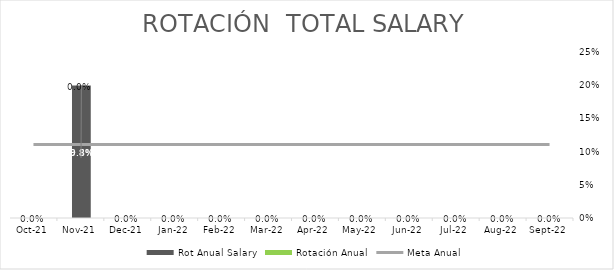
| Category | Rot Anual Salary | Rotación Anual |
|---|---|---|
| 2021-10-01 | 0 | 0 |
| 2021-11-01 | 0.198 | 0 |
| 2021-12-01 | 0 | 0 |
| 2022-01-01 | 0 | 0 |
| 2022-02-01 | 0 | 0 |
| 2022-03-01 | 0 | 0 |
| 2022-04-01 | 0 | 0 |
| 2022-05-01 | 0 | 0 |
| 2022-06-01 | 0 | 0 |
| 2022-07-01 | 0 | 0 |
| 2022-08-01 | 0 | 0 |
| 2022-09-01 | 0 | 0 |